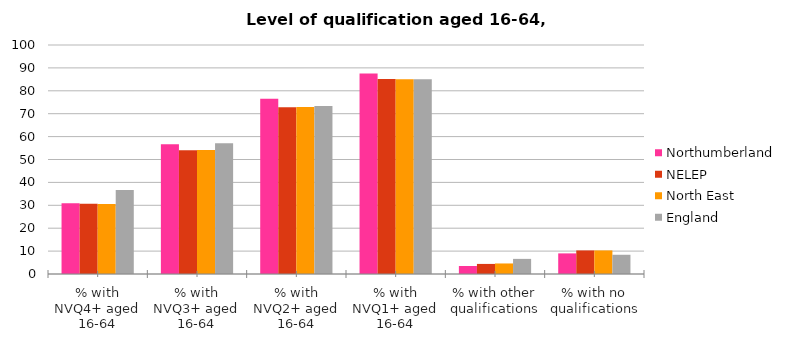
| Category | Northumberland | NELEP | North East | England |
|---|---|---|---|---|
| % with NVQ4+ aged 16-64 | 30.9 | 30.7 | 30.6 | 36.7 |
| % with NVQ3+ aged 16-64 | 56.7 | 54 | 54.2 | 57.1 |
| % with NVQ2+ aged 16-64 | 76.5 | 72.8 | 72.9 | 73.4 |
| % with NVQ1+ aged 16-64 | 87.6 | 85.2 | 85 | 85 |
| % with other qualifications | 3.5 | 4.4 | 4.6 | 6.6 |
| % with no qualifications | 9 | 10.3 | 10.3 | 8.4 |